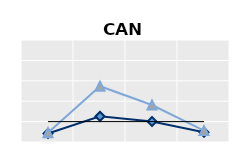
| Category | Public goods | Individual items only | Series 1 |
|---|---|---|---|
| 15-24 | 0.413 | 0.454 | 1 |
| 25-54 | 1.257 | 2.735 | 1 |
| 55-64 | 1.005 | 1.814 | 1 |
| 65+ | 0.482 | 0.558 | 1 |